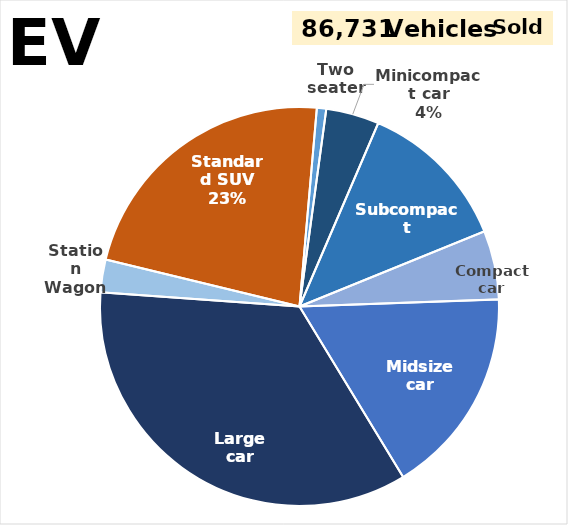
| Category | Series 0 |
|---|---|
| Two seater | 0.008 |
| Minicompact car | 0.043 |
| Subcompact | 0.124 |
| Compact car | 0.056 |
| Midsize car | 0.169 |
| Large car | 0.348 |
| Station Wagon | 0.027 |
| Standard SUV | 0.226 |